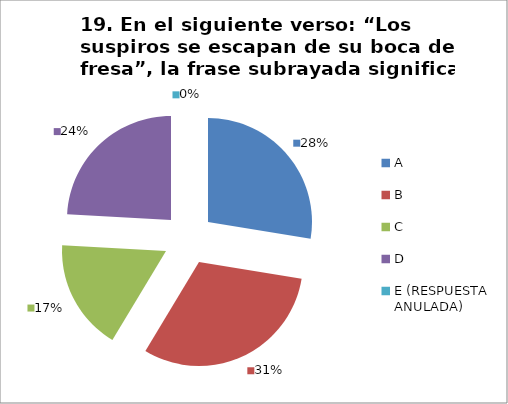
| Category | CANTIDAD DE RESPUESTAS PREGUNTA (19) | PORCENTAJE |
|---|---|---|
| A | 8 | 0.276 |
| B | 9 | 0.31 |
| C | 5 | 0.172 |
| D | 7 | 0.241 |
| E (RESPUESTA ANULADA) | 0 | 0 |